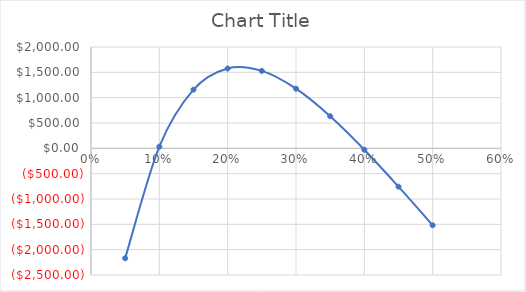
| Category | Series 0 |
|---|---|
| 0.05 | -2168.728 |
| 0.1 | 31.884 |
| 0.15000000000000002 | 1158.273 |
| 0.2 | 1576.003 |
| 0.25 | 1528 |
| 0.3 | 1177.197 |
| 0.35 | 633.647 |
| 0.39999999999999997 | -27.965 |
| 0.44999999999999996 | -756.852 |
| 0.49999999999999994 | -1518.519 |